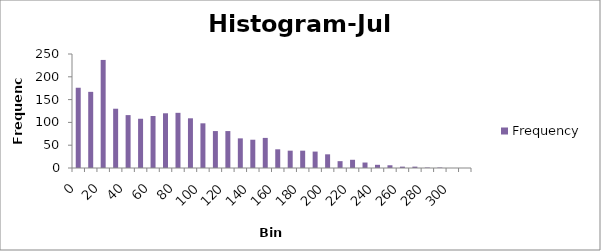
| Category | Frequency |
|---|---|
| 0 | 176 |
| 10 | 167 |
| 20 | 237 |
| 30 | 130 |
| 40 | 116 |
| 50 | 108 |
| 60 | 114 |
| 70 | 120 |
| 80 | 121 |
| 90 | 109 |
| 100 | 98 |
| 110 | 81 |
| 120 | 81 |
| 130 | 65 |
| 140 | 62 |
| 150 | 66 |
| 160 | 41 |
| 170 | 38 |
| 180 | 38 |
| 190 | 36 |
| 200 | 30 |
| 210 | 15 |
| 220 | 18 |
| 230 | 12 |
| 240 | 7 |
| 250 | 6 |
| 260 | 3 |
| 270 | 3 |
| 280 | 1 |
| 290 | 1 |
| 300 | 0 |
| More | 0 |